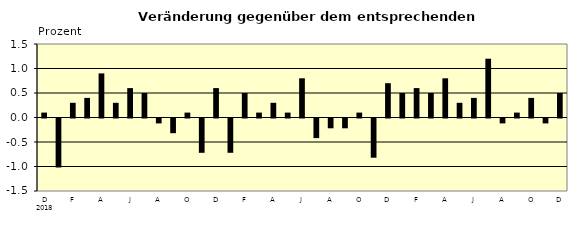
| Category | Series 0 |
|---|---|
| 0 | 0.1 |
| 1 | -1 |
| 2 | 0.3 |
| 3 | 0.4 |
| 4 | 0.9 |
| 5 | 0.3 |
| 6 | 0.6 |
| 7 | 0.5 |
| 8 | -0.1 |
| 9 | -0.3 |
| 10 | 0.1 |
| 11 | -0.7 |
| 12 | 0.6 |
| 13 | -0.7 |
| 14 | 0.5 |
| 15 | 0.1 |
| 16 | 0.3 |
| 17 | 0.1 |
| 18 | 0.8 |
| 19 | -0.4 |
| 20 | -0.2 |
| 21 | -0.2 |
| 22 | 0.1 |
| 23 | -0.8 |
| 24 | 0.7 |
| 25 | 0.5 |
| 26 | 0.6 |
| 27 | 0.5 |
| 28 | 0.8 |
| 29 | 0.3 |
| 30 | 0.4 |
| 31 | 1.2 |
| 32 | -0.1 |
| 33 | 0.1 |
| 34 | 0.4 |
| 35 | -0.1 |
| 36 | 0.5 |